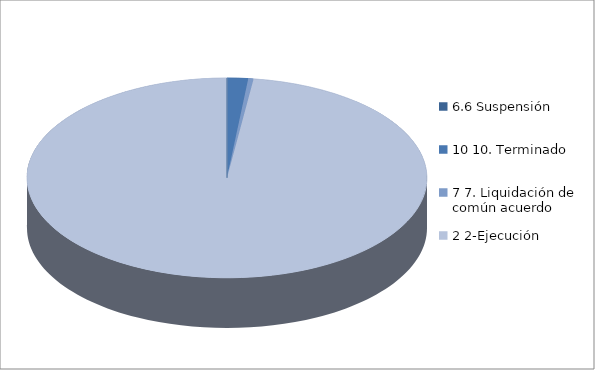
| Category | Series 0 |
|---|---|
| 6.6 Suspensión | 0 |
| 10 10. Terminado | 8 |
| 7 7. Liquidación de común acuerdo | 2 |
| 2 2-Ejecución | 462 |